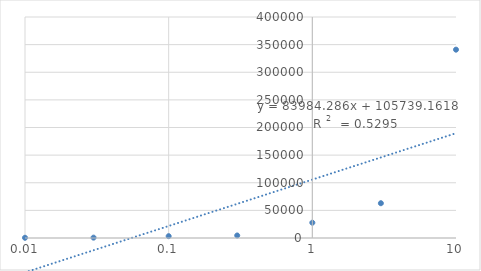
| Category | Series 0 |
|---|---|
| 0.01 | 425.8 |
| 0.03 | 647.967 |
| 0.1 | 3298.333 |
| 0.3 | 4550.667 |
| 1.0 | 27700.667 |
| 3.0 | 62942 |
| 10.0 | 340899.333 |